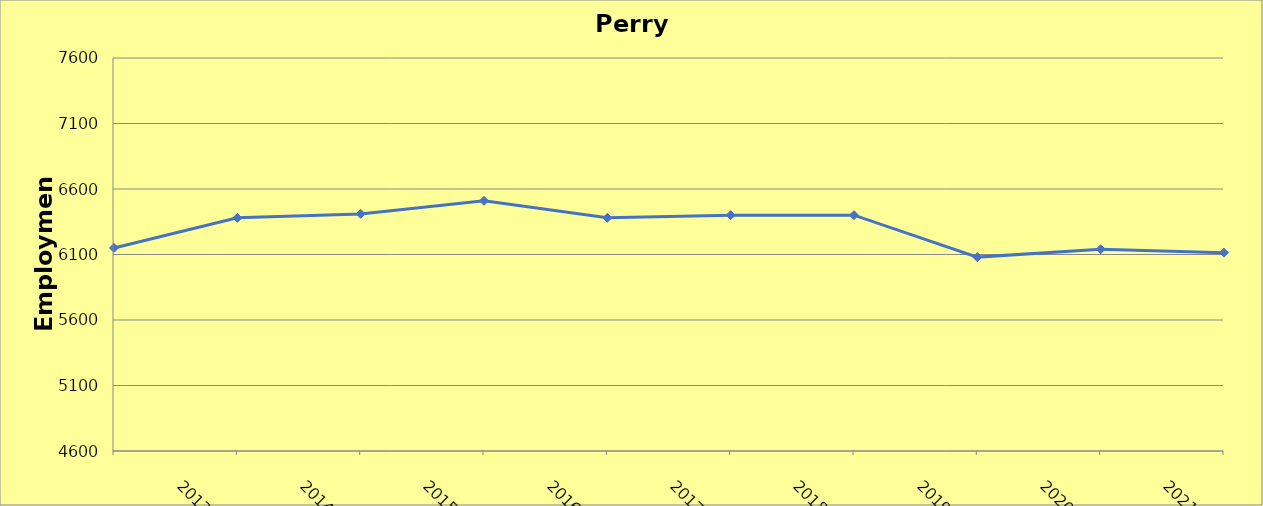
| Category | Perry County |
|---|---|
| 2013.0 | 6150 |
| 2014.0 | 6380 |
| 2015.0 | 6410 |
| 2016.0 | 6510 |
| 2017.0 | 6380 |
| 2018.0 | 6400 |
| 2019.0 | 6400 |
| 2020.0 | 6080 |
| 2021.0 | 6140 |
| 2022.0 | 6114 |